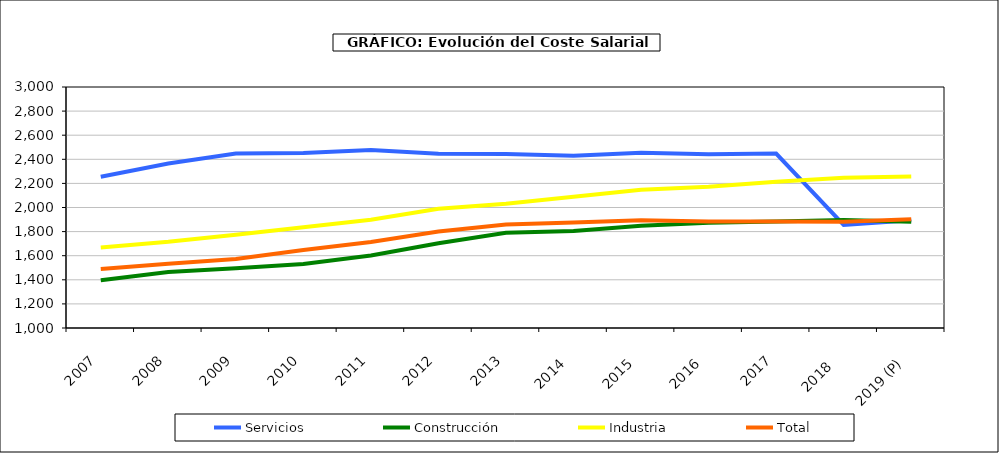
| Category | Servicios | Construcción | Industria | Total |
|---|---|---|---|---|
|  2007 | 2254.875 |  |  |  |
|  2008 | 2365.308 |  |  |  |
|  2009 | 2448.698 |  |  |  |
|  2010 | 2452.875 |  |  |  |
|  2011 | 2477.602 |  |  |  |
|  2012 | 2446.113 |  |  |  |
|  2013 | 2443.343 |  |  |  |
|  2014  | 2428.98 |  |  |  |
|  2015  | 2453.617 |  |  |  |
|  2016  | 2442.583 |  |  |  |
|  2017 | 2448.048 |  |  |  |
|  2018   | 1855.957 |  |  |  |
|  2019 (P)  | 1894.81 |  |  |  |